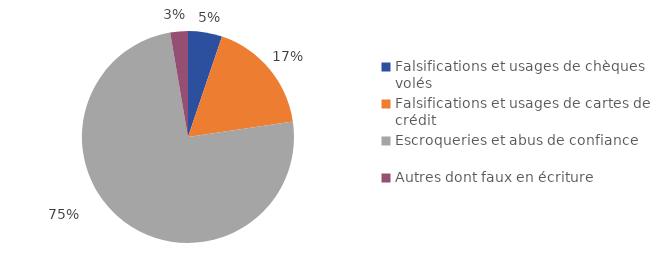
| Category | Series 0 |
|---|---|
| Falsifications et usages de chèques volés | 22000 |
| Falsifications et usages de cartes de crédit | 73800 |
| Escroqueries et abus de confiance | 315800 |
| Autres dont faux en écriture | 11400 |